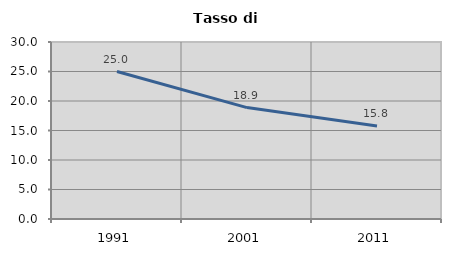
| Category | Tasso di disoccupazione   |
|---|---|
| 1991.0 | 25 |
| 2001.0 | 18.883 |
| 2011.0 | 15.777 |